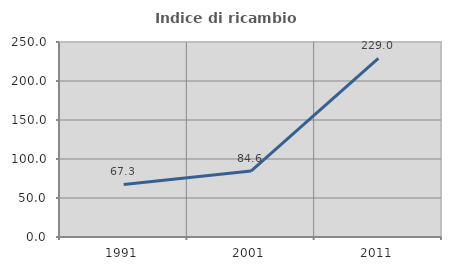
| Category | Indice di ricambio occupazionale  |
|---|---|
| 1991.0 | 67.322 |
| 2001.0 | 84.589 |
| 2011.0 | 228.956 |